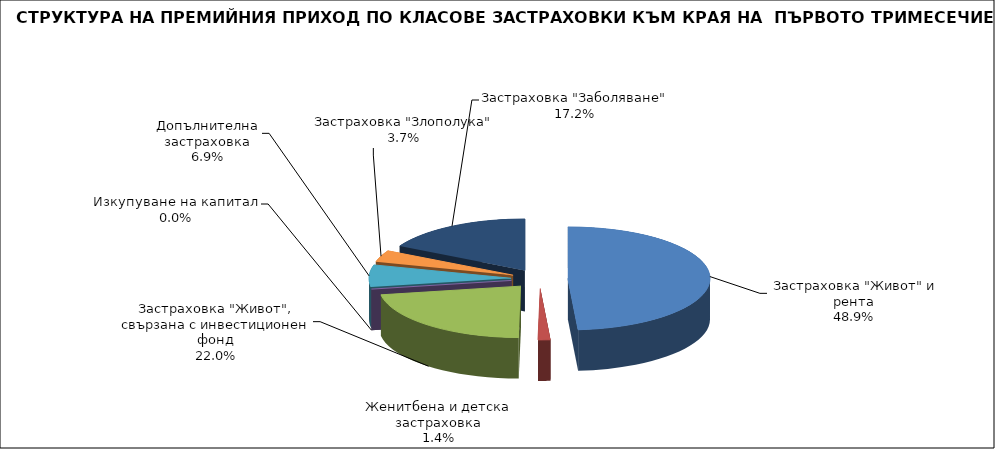
| Category |  Застраховка "Живот" и рента |
|---|---|
|  Застраховка "Живот" и рента | 63100902.235 |
| Женитбена и детска застраховка | 1807076.904 |
| Застраховка "Живот", свързана с инвестиционен фонд | 28467096.327 |
| Изкупуване на капитал | 0 |
| Допълнителна застраховка | 8908769.776 |
| Застраховка "Злополука" | 4725847.56 |
| Застраховка "Заболяване" | 22152832.31 |